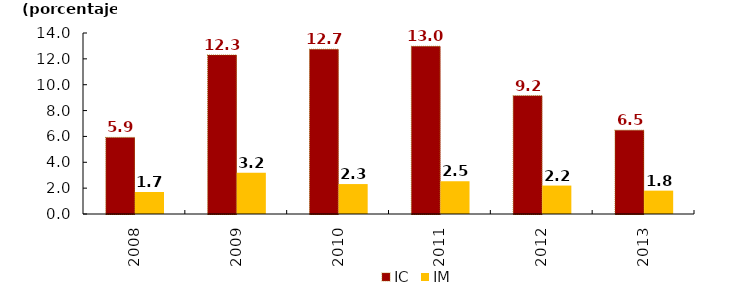
| Category | IC | IM |
|---|---|---|
| 2008.0 | 5.926 | 1.704 |
| 2009.0 | 12.3 | 3.197 |
| 2010.0 | 12.743 | 2.315 |
| 2011.0 | 12.973 | 2.528 |
| 2012.0 | 9.153 | 2.199 |
| 2013.0 | 6.487 | 1.807 |